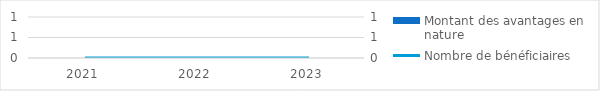
| Category | Montant des avantages en nature |
|---|---|
| 2021.0 | 0 |
| 2022.0 | 0 |
| 2023.0 | 0 |